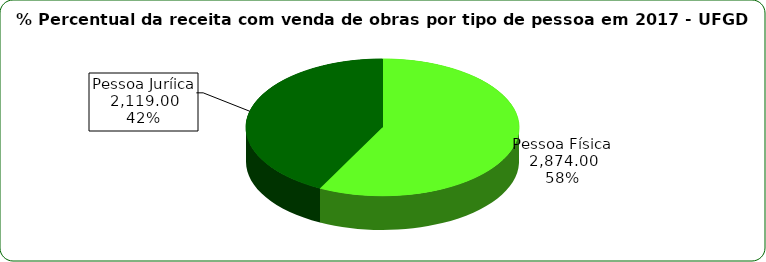
| Category | Series 0 |
|---|---|
| Pessoa Física | 2874 |
| Pessoa Juríica | 2119 |